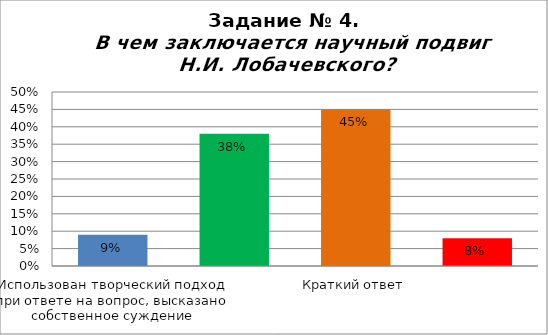
| Category | В чем заключается научный подвиг Н.И. Лобачевского? |
|---|---|
| Использован творческий подход при ответе на вопрос, высказано собственное суждение | 0.09 |
| При ответе на вопрос использованы материалы текста, без собственной оценки событий | 0.38 |
| Краткий ответ | 0.45 |
| Неверный ответ или не приступал | 0.08 |